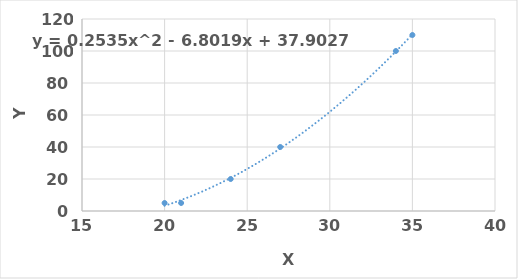
| Category | Y |
|---|---|
| 24.0 | 20 |
| 34.0 | 100 |
| 21.0 | 5 |
| 27.0 | 40 |
| 35.0 | 110 |
| 20.0 | 5 |